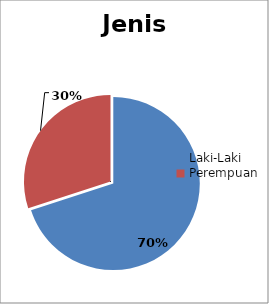
| Category | Jenis Kelamin |
|---|---|
| Laki-Laki | 0.7 |
| Perempuan | 0.3 |